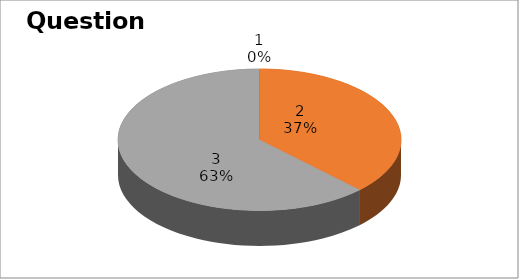
| Category | Series 0 |
|---|---|
| 0 | 0 |
| 1 | 12 |
| 2 | 20 |